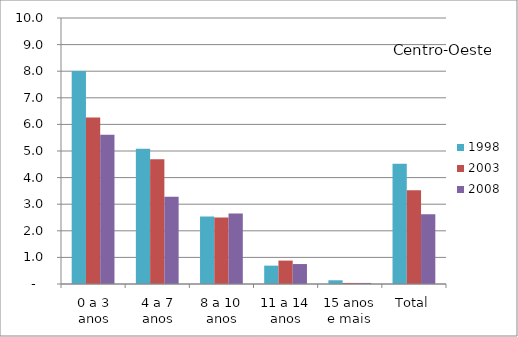
| Category | 1998 | 2003 | 2008 |
|---|---|---|---|
| 0 a 3 anos | 8.01 | 6.26 | 5.61 |
| 4 a 7 anos | 5.08 | 4.69 | 3.28 |
| 8 a 10 anos | 2.54 | 2.5 | 2.65 |
| 11 a 14 anos | 0.69 | 0.88 | 0.75 |
| 15 anos e mais | 0.14 | 0.04 | 0.04 |
| Total | 4.52 | 3.52 | 2.62 |